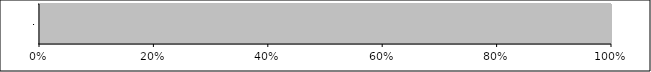
| Category | Series 0 | Series 1 | Series 2 | Series 3 | Series 4 |
|---|---|---|---|---|---|
| 0 | 0 | 0 | 0 | 0 | 30 |